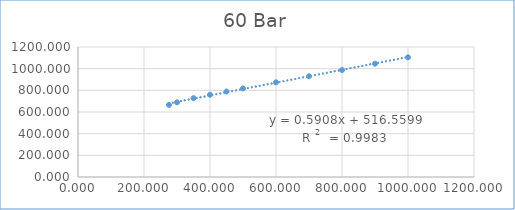
| Category | Series 0 |
|---|---|
| 275.6 | 665.217 |
| 300.0 | 689.322 |
| 350.0 | 727.162 |
| 400.0 | 759.245 |
| 450.0 | 789.035 |
| 500.0 | 817.75 |
| 600.0 | 874.032 |
| 700.0 | 930.315 |
| 800.0 | 987.363 |
| 900.0 | 1045.533 |
| 1000.0 | 1104.969 |